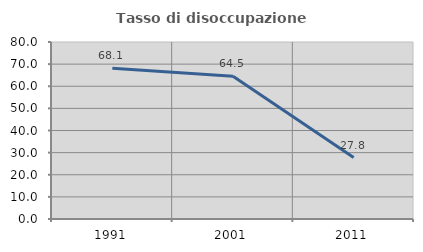
| Category | Tasso di disoccupazione giovanile  |
|---|---|
| 1991.0 | 68.116 |
| 2001.0 | 64.516 |
| 2011.0 | 27.778 |